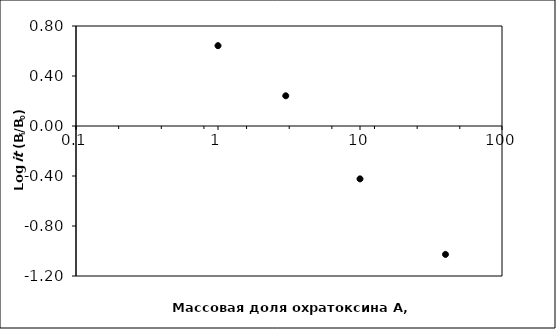
| Category | Series 1 |
|---|---|
| 1.0 | 0.643 |
| 3.0 | 0.242 |
| 10.0 | -0.423 |
| 40.0 | -1.027 |